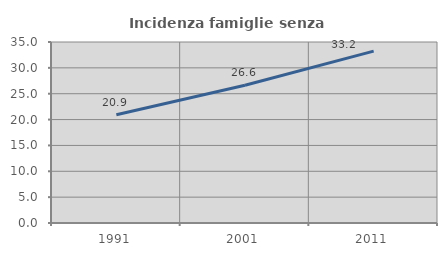
| Category | Incidenza famiglie senza nuclei |
|---|---|
| 1991.0 | 20.926 |
| 2001.0 | 26.625 |
| 2011.0 | 33.241 |